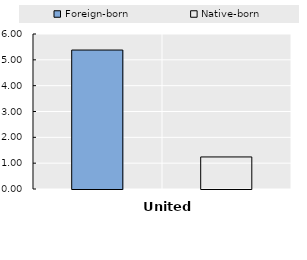
| Category | United Kingdom |
|---|---|
| Foreign-born | 5.379 |
| Native-born | 1.241 |